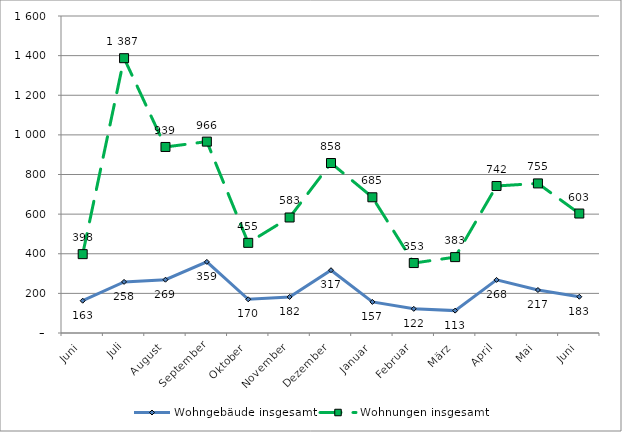
| Category | Wohngebäude insgesamt | Wohnungen insgesamt |
|---|---|---|
| Juni | 163 | 398 |
| Juli | 258 | 1387 |
| August | 269 | 939 |
| September | 359 | 966 |
| Oktober | 170 | 455 |
| November | 182 | 583 |
| Dezember | 317 | 858 |
| Januar | 157 | 685 |
| Februar | 122 | 353 |
| März | 113 | 383 |
| April | 268 | 742 |
| Mai | 217 | 755 |
| Juni | 183 | 603 |